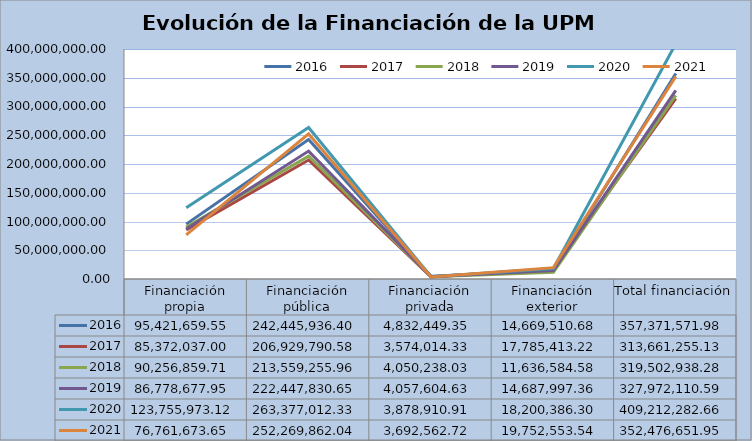
| Category | 2016 | 2017 | 2018 | 2019 | 2020 | 2021 |
|---|---|---|---|---|---|---|
| Financiación propia | 95421659.55 | 85372037 | 90256859.71 | 86778677.95 | 123755973.12 | 76761673.65 |
| Financiación pública | 242445936.4 | 206929790.58 | 213559255.96 | 222447830.65 | 263377012.33 | 252269862.04 |
| Financiación privada | 4832449.35 | 3574014.33 | 4050238.03 | 4057604.63 | 3878910.91 | 3692562.72 |
| Financiación exterior | 14669510.68 | 17785413.22 | 11636584.58 | 14687997.36 | 18200386.3 | 19752553.54 |
| Total financiación  | 357371571.98 | 313661255.13 | 319502938.28 | 327972110.59 | 409212282.66 | 352476651.95 |